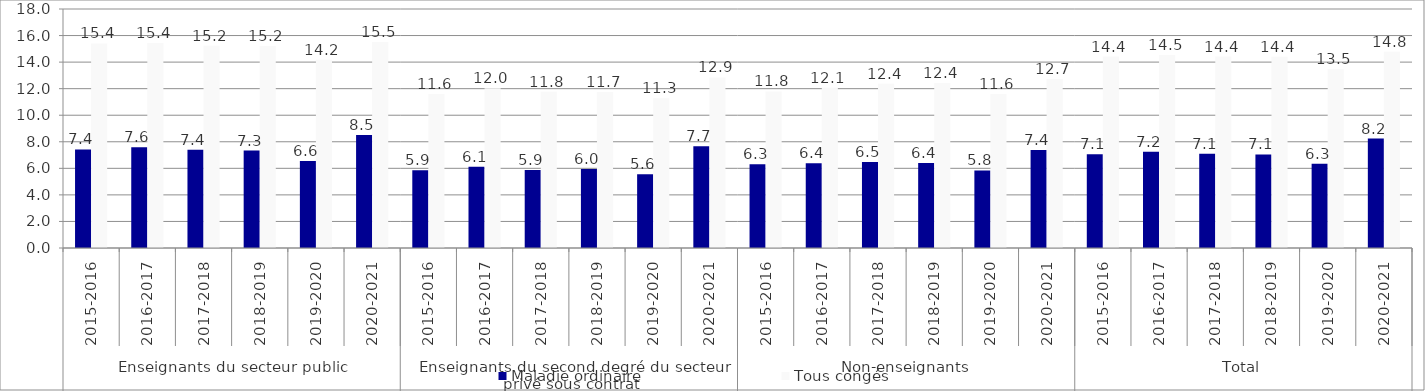
| Category | Maladie ordinaire | Tous congés |
|---|---|---|
| 0 | 7.42 | 15.41 |
| 1 | 7.59 | 15.43 |
| 2 | 7.4 | 15.24 |
| 3 | 7.34 | 15.21 |
| 4 | 6.55 | 14.18 |
| 5 | 8.51 | 15.51 |
| 6 | 5.85 | 11.59 |
| 7 | 6.11 | 12.04 |
| 8 | 5.87 | 11.77 |
| 9 | 5.95 | 11.74 |
| 10 | 5.55 | 11.28 |
| 11 | 7.66 | 12.85 |
| 12 | 6.3 | 11.79 |
| 13 | 6.39 | 12.06 |
| 14 | 6.47 | 12.37 |
| 15 | 6.4 | 12.43 |
| 16 | 5.84 | 11.59 |
| 17 | 7.38 | 12.73 |
| 18 | 7.07 | 14.42 |
| 19 | 7.24 | 14.53 |
| 20 | 7.09 | 14.42 |
| 21 | 7.05 | 14.4 |
| 22 | 6.34 | 13.46 |
| 23 | 8.24 | 14.78 |